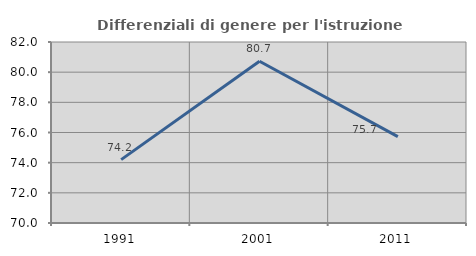
| Category | Differenziali di genere per l'istruzione superiore |
|---|---|
| 1991.0 | 74.203 |
| 2001.0 | 80.725 |
| 2011.0 | 75.726 |